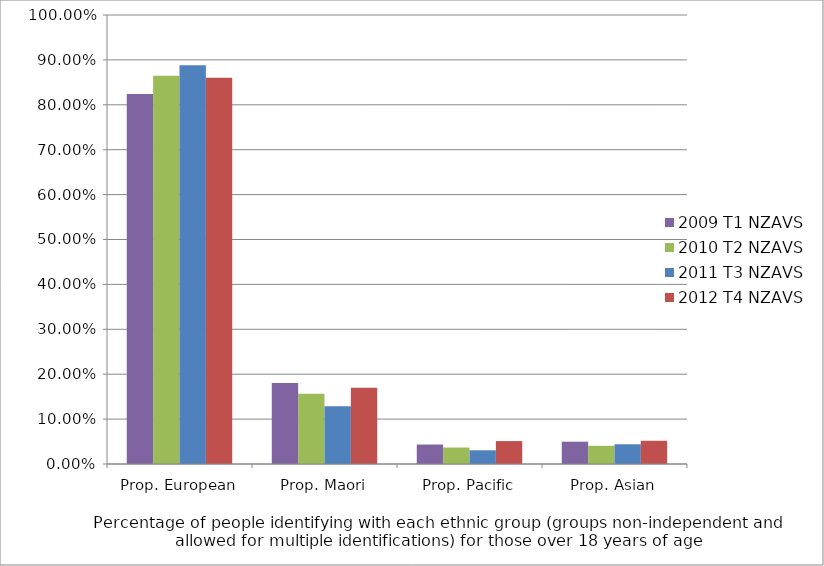
| Category | 2009 T1 NZAVS | 2010 T2 NZAVS | 2011 T3 NZAVS | 2012 T4 NZAVS |
|---|---|---|---|---|
| Prop. European | 0.824 | 0.865 | 0.888 | 0.86 |
| Prop. Maori | 0.18 | 0.156 | 0.129 | 0.17 |
| Prop. Pacific | 0.043 | 0.037 | 0.031 | 0.051 |
| Prop. Asian | 0.05 | 0.041 | 0.044 | 0.052 |